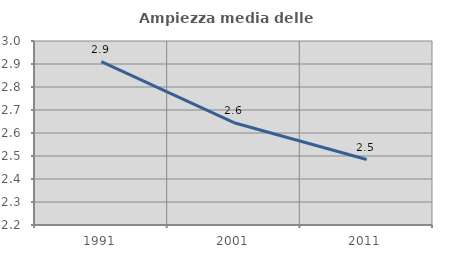
| Category | Ampiezza media delle famiglie |
|---|---|
| 1991.0 | 2.91 |
| 2001.0 | 2.645 |
| 2011.0 | 2.485 |